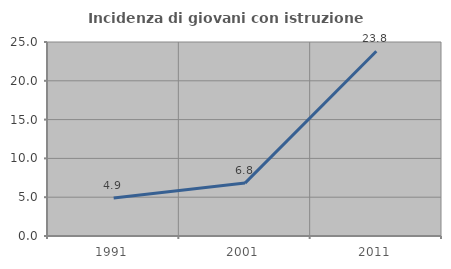
| Category | Incidenza di giovani con istruzione universitaria |
|---|---|
| 1991.0 | 4.902 |
| 2001.0 | 6.818 |
| 2011.0 | 23.81 |